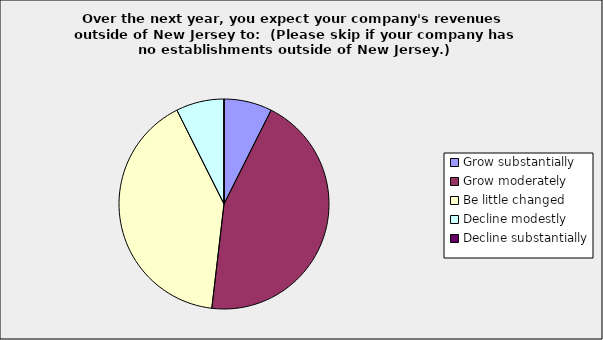
| Category | Series 0 |
|---|---|
| Grow substantially | 0.074 |
| Grow moderately | 0.444 |
| Be little changed | 0.407 |
| Decline modestly | 0.074 |
| Decline substantially | 0 |